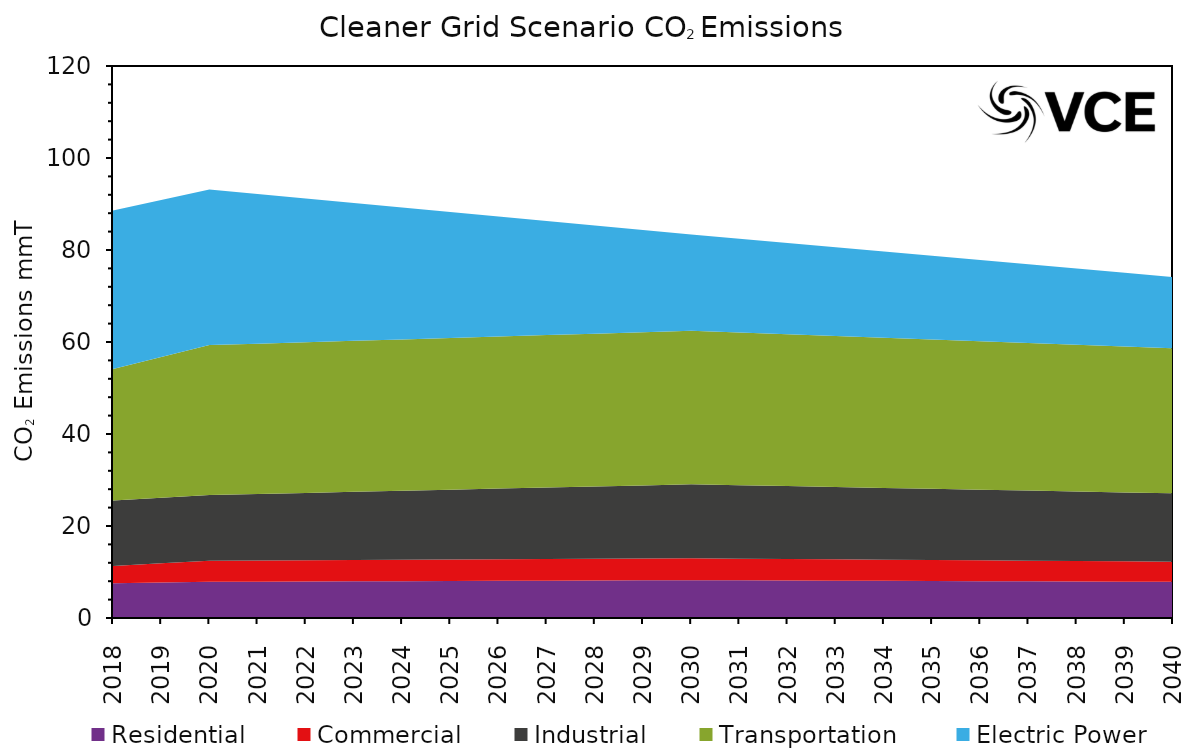
| Category | Residential | Commercial | Industrial | Transportation  | Electric Power |
|---|---|---|---|---|---|
| 2018.0 | 7.535 | 3.793 | 14.212 | 28.599 | 34.44 |
| 2019.0 | 7.697 | 4.197 | 14.241 | 30.599 | 34.12 |
| 2020.0 | 7.86 | 4.6 | 14.27 | 32.6 | 33.8 |
| 2021.0 | 7.896 | 4.615 | 14.452 | 32.677 | 32.512 |
| 2022.0 | 7.932 | 4.63 | 14.634 | 32.754 | 31.224 |
| 2023.0 | 7.968 | 4.645 | 14.816 | 32.831 | 29.936 |
| 2024.0 | 8.004 | 4.66 | 14.998 | 32.908 | 28.648 |
| 2025.0 | 8.04 | 4.675 | 15.18 | 32.985 | 27.36 |
| 2026.0 | 8.076 | 4.69 | 15.362 | 33.062 | 26.072 |
| 2027.0 | 8.112 | 4.705 | 15.544 | 33.139 | 24.784 |
| 2028.0 | 8.148 | 4.72 | 15.726 | 33.216 | 23.496 |
| 2029.0 | 8.184 | 4.735 | 15.908 | 33.293 | 22.208 |
| 2030.0 | 8.22 | 4.75 | 16.09 | 33.37 | 20.92 |
| 2031.0 | 8.185 | 4.713 | 15.967 | 33.185 | 20.377 |
| 2032.0 | 8.15 | 4.676 | 15.844 | 33 | 19.834 |
| 2033.0 | 8.115 | 4.639 | 15.721 | 32.815 | 19.291 |
| 2034.0 | 8.08 | 4.602 | 15.598 | 32.63 | 18.748 |
| 2035.0 | 8.045 | 4.565 | 15.475 | 32.445 | 18.205 |
| 2036.0 | 8.01 | 4.528 | 15.352 | 32.26 | 17.662 |
| 2037.0 | 7.975 | 4.491 | 15.229 | 32.075 | 17.119 |
| 2038.0 | 7.94 | 4.454 | 15.106 | 31.89 | 16.576 |
| 2039.0 | 7.905 | 4.417 | 14.983 | 31.705 | 16.033 |
| 2040.0 | 7.87 | 4.38 | 14.86 | 31.52 | 15.49 |